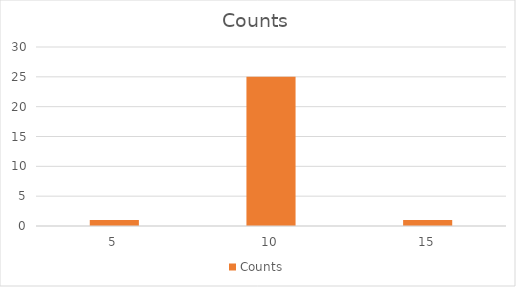
| Category | Counts |
|---|---|
| 5.0 | 1 |
| 10.0 | 25 |
| 15.0 | 1 |